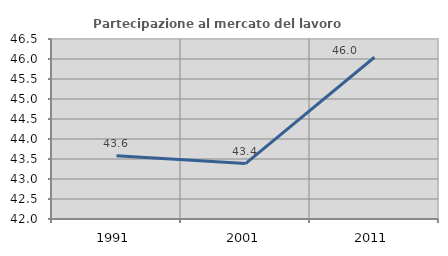
| Category | Partecipazione al mercato del lavoro  femminile |
|---|---|
| 1991.0 | 43.581 |
| 2001.0 | 43.386 |
| 2011.0 | 46.044 |